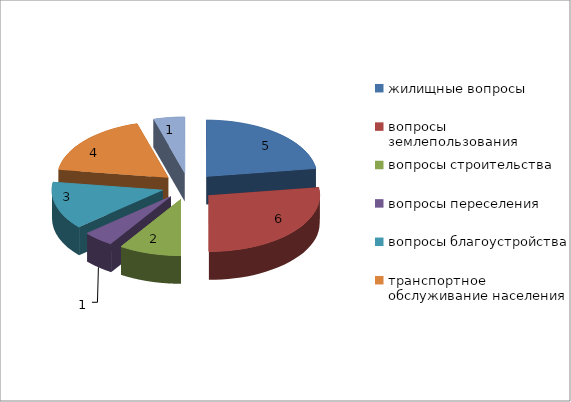
| Category | Series 0 |
|---|---|
| жилищные вопросы | 5 |
| вопросы землепользования | 6 |
| вопросы строительства | 2 |
| вопросы переселения | 1 |
| вопросы благоустройства | 3 |
| транспортное обслуживание населения | 4 |
| оказание социальной помощи | 1 |